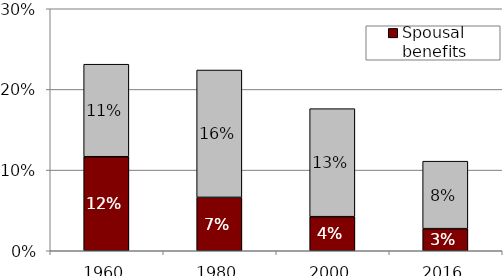
| Category | Spousal benefits | Widow benefits  |
|---|---|---|
| 1960.0 | 0.117 | 0.115 |
| 1980.0 | 0.066 | 0.158 |
| 2000.0 | 0.042 | 0.134 |
| 2016.0 | 0.027 | 0.084 |